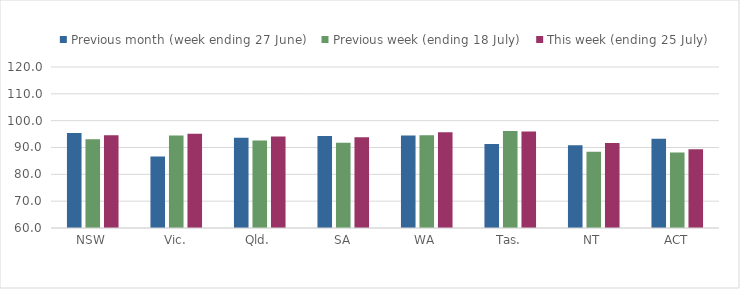
| Category | Previous month (week ending 27 June) | Previous week (ending 18 July) | This week (ending 25 July) |
|---|---|---|---|
| NSW | 95.448 | 93.065 | 94.61 |
| Vic. | 86.608 | 94.473 | 95.114 |
| Qld. | 93.641 | 92.645 | 94.098 |
| SA | 94.299 | 91.741 | 93.804 |
| WA | 94.459 | 94.522 | 95.655 |
| Tas. | 91.315 | 96.179 | 95.976 |
| NT | 90.807 | 88.462 | 91.666 |
| ACT | 93.289 | 88.119 | 89.32 |